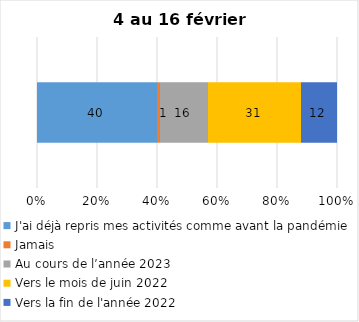
| Category | J'ai déjà repris mes activités comme avant la pandémie | Jamais | Au cours de l’année 2023 | Vers le mois de juin 2022 | Vers la fin de l'année 2022 |
|---|---|---|---|---|---|
| 0 | 40 | 1 | 16 | 31 | 12 |